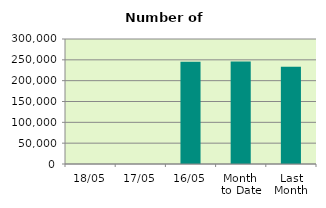
| Category | Series 0 |
|---|---|
| 18/05 | 0 |
| 17/05 | 0 |
| 16/05 | 245532 |
| Month 
to Date | 245952.364 |
| Last
Month | 233247 |